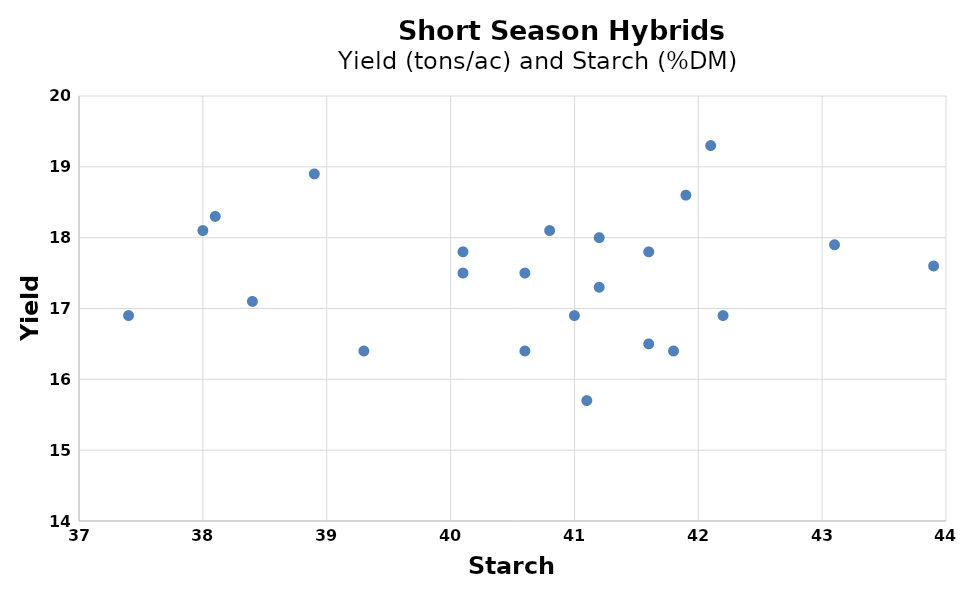
| Category | Series 0 |
|---|---|
| 44.3 | 14.1 |
| 43.1 | 17.9 |
| 42.1 | 19.3 |
| 40.6 | 17.5 |
| 41.6 | 16.5 |
| 43.9 | 17.6 |
| 41.2 | 17.3 |
| 41.9 | 18.6 |
| 42.2 | 16.9 |
| 41.8 | 16.4 |
| 41.0 | 16.9 |
| 41.2 | 18 |
| 40.8 | 18.1 |
| 36.9 | 17.7 |
| 38.0 | 18.1 |
| 40.1 | 17.5 |
| 40.1 | 17.8 |
| 40.6 | 16.4 |
| 38.4 | 17.1 |
| 41.6 | 17.8 |
| 41.1 | 15.7 |
| 39.3 | 16.4 |
| 38.9 | 18.9 |
| 36.6 | 15.4 |
| 38.1 | 18.3 |
| 37.4 | 16.9 |